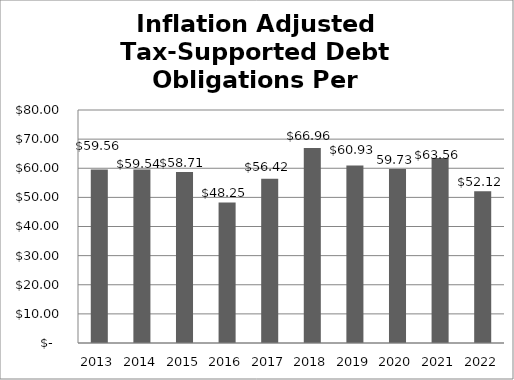
| Category | 2013 |
|---|---|
| 2013.0 | 59.564 |
| 2014.0 | 59.538 |
| 2015.0 | 58.708 |
| 2016.0 | 48.253 |
| 2017.0 | 56.417 |
| 2018.0 | 66.965 |
| 2019.0 | 60.927 |
| 2020.0 | 59.73 |
| 2021.0 | 63.56 |
| 2022.0 | 52.121 |